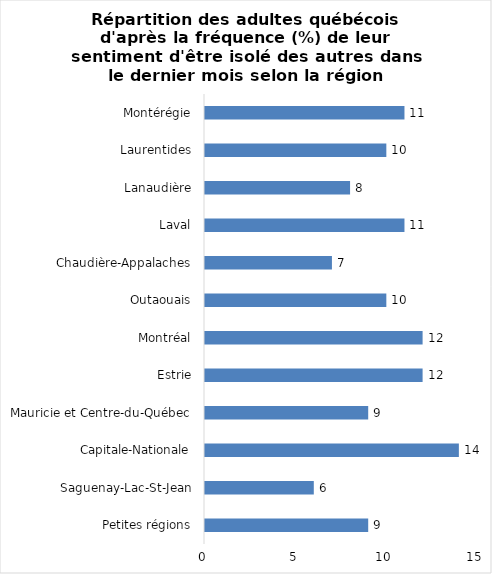
| Category | Series 0 |
|---|---|
| Petites régions | 9 |
| Saguenay-Lac-St-Jean | 6 |
| Capitale-Nationale | 14 |
| Mauricie et Centre-du-Québec | 9 |
| Estrie | 12 |
| Montréal | 12 |
| Outaouais | 10 |
| Chaudière-Appalaches | 7 |
| Laval | 11 |
| Lanaudière | 8 |
| Laurentides | 10 |
| Montérégie | 11 |